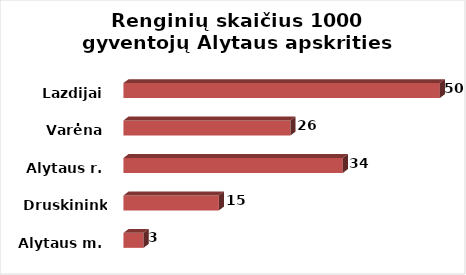
| Category | Series 0 |
|---|---|
| Alytaus m. | 3.15 |
| Druskininkai | 14.987 |
| Alytaus r. | 34.44 |
| Varėna | 26.218 |
| Lazdijai | 49.666 |